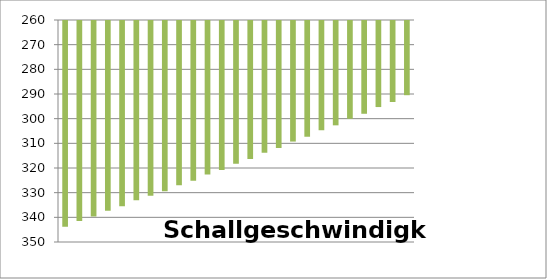
| Category | Schallgeschwindigkeit |
|---|---|
| 0 | 343.42 |
| 1 | 341.07 |
| 2 | 339.29 |
| 3 | 336.92 |
| 4 | 335.12 |
| 5 | 332.71 |
| 6 | 330.89 |
| 7 | 329.06 |
| 8 | 326.61 |
| 9 | 324.76 |
| 10 | 322.27 |
| 11 | 320.39 |
| 12 | 317.87 |
| 13 | 315.97 |
| 14 | 313.41 |
| 15 | 311.48 |
| 16 | 308.88 |
| 17 | 306.92 |
| 18 | 304.29 |
| 19 | 302.3 |
| 20 | 299.63 |
| 21 | 297.61 |
| 22 | 294.89 |
| 23 | 292.84 |
| 24 | 290.08 |